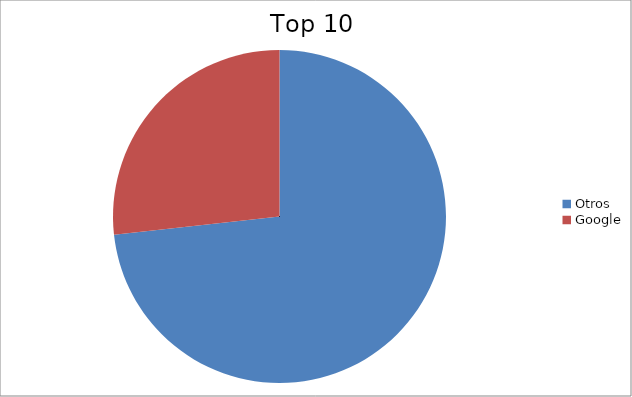
| Category | Series 0 |
|---|---|
| Otros | 73.25 |
| Google | 26.75 |